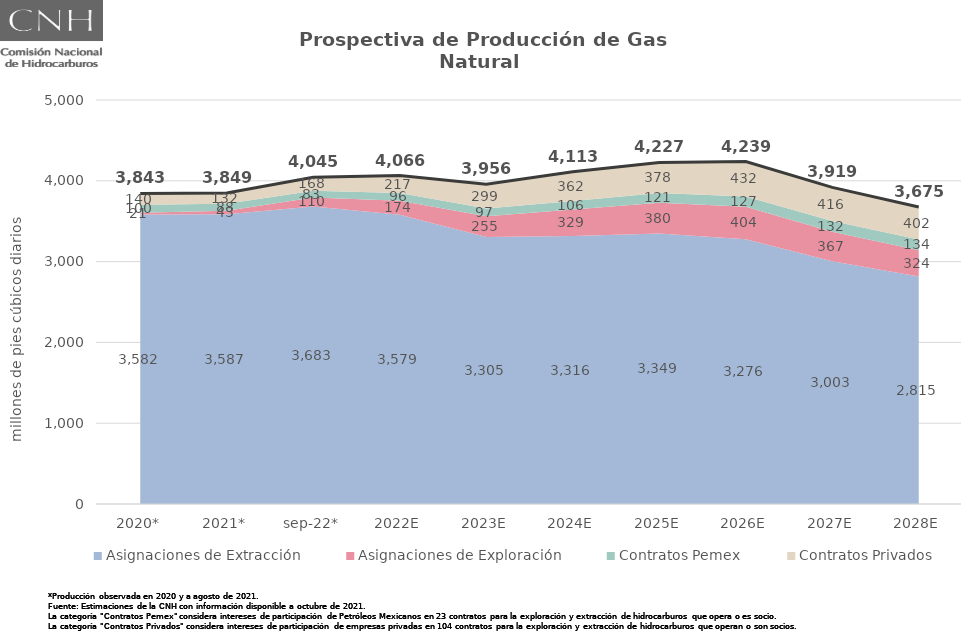
| Category | Total |
|---|---|
| 2020* | 3843.295 |
| 2021* | 3849.174 |
| sep-22* | 4044.539 |
| 2022E | 4065.509 |
| 2023E | 3956.237 |
| 2024E | 4113.094 |
| 2025E | 4227.383 |
| 2026E | 4238.731 |
| 2027E | 3918.633 |
| 2028E | 3674.987 |